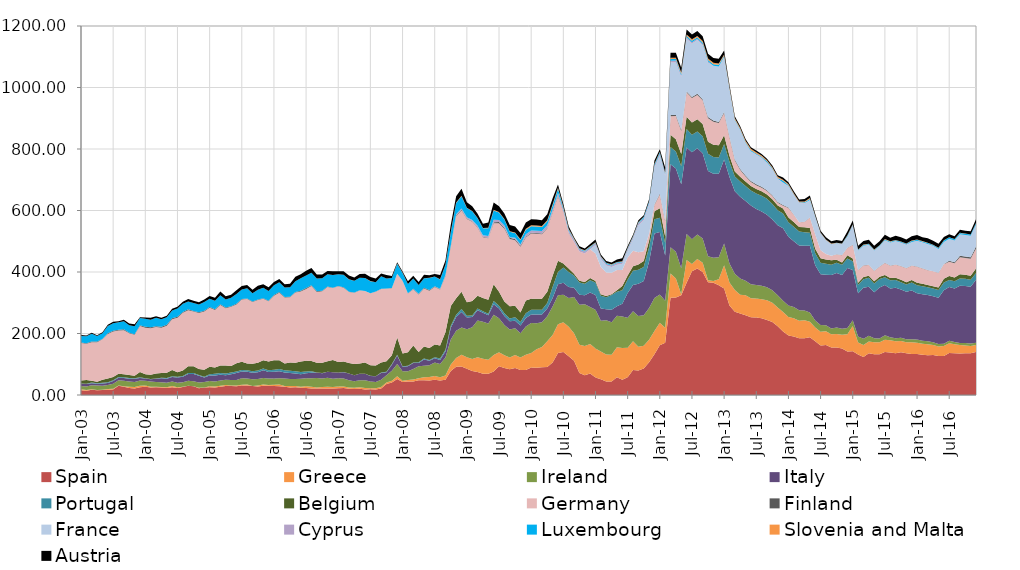
| Category | Spain | Greece | Ireland | Italy | Portugal | Belgium | Germany | Finland | France | Cyprus | Luxembourg | Slovenia and Malta | Austria |
|---|---|---|---|---|---|---|---|---|---|---|---|---|---|
| 2003-01-01 | 15.515 | 3.067 | 10.988 | 6.915 | 0.647 | 10.416 | 121.205 | 1.818 | 0 | 0 | 21.454 | 0 | 3.327 |
| 2003-02-01 | 13.8 | 2.514 | 11.517 | 7.706 | 1.084 | 12.039 | 118.189 | 1.772 | 0 | 0 | 22.341 | 0 | 2.363 |
| 2003-03-01 | 16.86 | 2.178 | 12.731 | 6.693 | 2.017 | 6.099 | 124.944 | 2.434 | 0 | 0 | 24.885 | 0 | 3.949 |
| 2003-04-01 | 15.463 | 1.047 | 14.236 | 5.653 | 1.968 | 5.075 | 127.952 | 2.67 | 0 | 0 | 17.618 | 0 | 2.282 |
| 2003-05-01 | 16.138 | 0.646 | 13.237 | 7.643 | 2.015 | 10.236 | 131.226 | 0.92 | 0 | 0 | 18.885 | 0 | 2.784 |
| 2003-06-01 | 17.219 | 2.057 | 13.414 | 6.483 | 2.591 | 11.643 | 145.262 | 2.526 | 0 | 0 | 23.576 | 0 | 3.982 |
| 2003-07-01 | 18.129 | 1.794 | 16.707 | 9.13 | 2.563 | 9.997 | 147.976 | 2.43 | 0 | 0 | 24.408 | 0 | 5.175 |
| 2003-08-01 | 30.088 | 1.069 | 16.866 | 8.367 | 2.132 | 10.587 | 140.59 | 2.233 | 0 | 0 | 24.505 | 0 | 3.4 |
| 2003-09-01 | 26.642 | 2.083 | 17.233 | 9.536 | 2.231 | 10.097 | 143.13 | 2.564 | 0 | 0 | 26.068 | 0 | 5.37 |
| 2003-10-01 | 22.472 | 4.554 | 16.546 | 9.413 | 1.936 | 10.04 | 136.182 | 0.892 | 0 | 0 | 25.028 | 0 | 5.225 |
| 2003-11-01 | 20.786 | 5.404 | 15.718 | 11.242 | 1.29 | 8.5 | 133.087 | 1.627 | 0 | 0 | 26.238 | 0 | 6.577 |
| 2003-12-01 | 25.563 | 4.342 | 17.509 | 8.191 | 2.493 | 16.749 | 149.156 | 2.85 | 0 | 0 | 23.402 | 0 | 2.897 |
| 2004-01-01 | 27.127 | 4.005 | 14.877 | 7.876 | 0.249 | 13.075 | 151.754 | 3.065 | 0 | 0 | 25.533 | 0 | 4.539 |
| 2004-02-01 | 24.424 | 2.443 | 16.656 | 7.992 | 0.851 | 13.217 | 151.34 | 3.357 | 0 | 0 | 24.462 | 0 | 6.624 |
| 2004-03-01 | 25.182 | 1.244 | 15.864 | 10.796 | 0.844 | 16.36 | 150.927 | 2.717 | 0 | 0 | 26.954 | 0 | 5.249 |
| 2004-04-01 | 24.353 | 1.353 | 15.658 | 12.733 | 1.626 | 16.201 | 146.595 | 3.059 | 0 | 0 | 25.053 | 0 | 4.723 |
| 2004-05-01 | 22.75 | 2.341 | 15.007 | 12.968 | 2.253 | 17.399 | 152.573 | 3 | 0 | 0 | 24.603 | 0 | 4.864 |
| 2004-06-01 | 25.291 | 3.888 | 14.862 | 14.899 | 2.435 | 19.843 | 165.092 | 3.232 | 0 | 0 | 25.497 | 0 | 5.296 |
| 2004-07-01 | 22.648 | 2.882 | 14.613 | 16.528 | 2.604 | 14.527 | 177.509 | 3.318 | 0 | 0 | 27.008 | 0 | 5.467 |
| 2004-08-01 | 26.131 | 0.549 | 14.929 | 17.773 | 2.694 | 17.852 | 187.26 | 2.982 | 0 | 0 | 26.824 | 0 | 6.161 |
| 2004-09-01 | 30.412 | 0.075 | 16.024 | 21.572 | 3.38 | 21.93 | 181.979 | 3.323 | 0 | 0 | 25.412 | 0 | 8.248 |
| 2004-10-01 | 28.083 | 0.691 | 15.811 | 23.414 | 3.417 | 21.951 | 177.901 | 1.65 | 0 | 0 | 25.949 | 0 | 7.851 |
| 2004-11-01 | 22.292 | 1.159 | 17.34 | 21.715 | 2.632 | 19.697 | 182.182 | 2.194 | 0 | 0 | 24.754 | 0 | 7.578 |
| 2004-12-01 | 24.537 | 0.201 | 17.44 | 14.63 | 2.873 | 22.695 | 188.903 | 2.45 | 0 | 0 | 28.354 | 0 | 8.854 |
| 2005-01-01 | 25.135 | 3.199 | 16.959 | 17.837 | 4.246 | 24.76 | 191.541 | 2.598 | 0 | 0 | 26.873 | 0 | 8.951 |
| 2005-02-01 | 24.35 | 3.499 | 16.11 | 19.5 | 5.957 | 19.657 | 187.186 | 2.89 | 0 | 0 | 27.187 | 0 | 9.655 |
| 2005-03-01 | 26.527 | 3.328 | 16.918 | 19.309 | 5.77 | 23.703 | 197.348 | 2.13 | 0 | 0 | 29.278 | 0 | 12.427 |
| 2005-04-01 | 29.672 | 2.498 | 17.1 | 15.045 | 5.803 | 25.551 | 186.301 | 2.215 | 0 | 0 | 26.72 | 0 | 9.909 |
| 2005-05-01 | 29.049 | 2.158 | 17.301 | 18.902 | 5.778 | 21.097 | 193.042 | 1.515 | 0 | 0 | 27.386 | 0 | 9.99 |
| 2005-06-01 | 28.525 | 2.338 | 18.004 | 22.543 | 5.154 | 26.289 | 191.856 | 1.827 | 0 | 0 | 32.257 | 0 | 11.493 |
| 2005-07-01 | 30.833 | 2.561 | 21.188 | 22.036 | 5.053 | 26.382 | 202.505 | 1.73 | 0 | 0 | 31.109 | 0 | 11.292 |
| 2005-08-01 | 31.234 | 2.84 | 19.294 | 22.137 | 5.054 | 22.284 | 209.497 | 1.76 | 0 | 0 | 32.759 | 0 | 10.832 |
| 2005-09-01 | 29.186 | 0.416 | 21.773 | 21.037 | 4.783 | 24.234 | 201.01 | 1.809 | 0 | 0 | 26.727 | 0 | 11.426 |
| 2005-10-01 | 27.844 | 2.96 | 21.423 | 22.071 | 5.374 | 24.845 | 204.499 | 1.921 | 0 | 0 | 31.377 | 0 | 12.68 |
| 2005-11-01 | 30.35 | 3.812 | 21.391 | 25.061 | 5.392 | 27.251 | 199.563 | 1.92 | 0 | 0 | 33.949 | 0 | 11.171 |
| 2005-12-01 | 30.312 | 2.354 | 20.99 | 21.277 | 5.392 | 28.95 | 195.335 | 1.692 | 0 | 0 | 31.796 | 0 | 12.512 |
| 2006-01-01 | 29.041 | 4.182 | 20.282 | 22.439 | 6.439 | 30.786 | 209.811 | 2.143 | 0 | 0 | 32.017 | 0 | 10.294 |
| 2006-02-01 | 28.63 | 5.319 | 20.845 | 22.097 | 7.501 | 28.238 | 219.683 | 2.605 | 0 | 0 | 31.843 | 0 | 10.408 |
| 2006-03-01 | 26.846 | 2.749 | 23.729 | 19.54 | 7.417 | 22.455 | 214.098 | 2.161 | 0 | 0 | 30.215 | 0 | 11.092 |
| 2006-04-01 | 24.753 | 4.803 | 22.126 | 19.671 | 7.312 | 26.868 | 212.076 | 1.875 | 0 | 0 | 31.208 | 0 | 11.319 |
| 2006-05-01 | 25.273 | 4.109 | 22.89 | 17.83 | 7.305 | 27.16 | 228.451 | 2.33 | 0 | 0 | 34.753 | 0 | 14.381 |
| 2006-06-01 | 23.339 | 3.128 | 26.001 | 14.791 | 7.777 | 34.067 | 227.597 | 2.723 | 0 | 0 | 40.583 | 0 | 13.007 |
| 2006-07-01 | 22.688 | 5.488 | 26.269 | 16.335 | 5.931 | 34.372 | 233.938 | 2.89 | 0 | 0 | 40.62 | 0 | 15.932 |
| 2006-08-01 | 21.423 | 5.652 | 27.608 | 17.806 | 4.588 | 33.77 | 243.679 | 2.418 | 0 | 0 | 40.981 | 0 | 15.141 |
| 2006-09-01 | 21.299 | 3.355 | 30.36 | 18.12 | 0.226 | 31.343 | 230.228 | 2.707 | 0 | 0 | 40.906 | 0 | 13.326 |
| 2006-10-01 | 21.32 | 4.339 | 28.024 | 17.418 | 0.187 | 33.44 | 232.304 | 1.927 | 0 | 0 | 40.837 | 0 | 11.994 |
| 2006-11-01 | 21.332 | 5.596 | 28.861 | 20.02 | 0.159 | 33.569 | 241.453 | 2.124 | 0 | 0 | 39.963 | 0 | 10.273 |
| 2006-12-01 | 21.168 | 4.795 | 27.044 | 20.957 | 0.161 | 39.91 | 233.634 | 1.025 | 0 | 0 | 41.511 | 0 | 12.151 |
| 2007-01-01 | 21.706 | 5.92 | 27.13 | 18.329 | 0.189 | 34.317 | 246.094 | 0.875 | 0 | 0 | 38.23 | 0.007 | 9.683 |
| 2007-02-01 | 22.575 | 5.105 | 26.146 | 20.507 | 0.181 | 34.329 | 240.265 | 0.895 | 0 | 0 | 41.336 | 0.05 | 11.208 |
| 2007-03-01 | 20.577 | 3.533 | 24.02 | 21.664 | 0.169 | 34.335 | 230.706 | 0.846 | 0 | 0 | 40.128 | 0.086 | 12.534 |
| 2007-04-01 | 19.447 | 4.297 | 20.717 | 19.462 | 0.502 | 36.13 | 232.105 | 0.836 | 0 | 0 | 38.147 | 0.074 | 10.245 |
| 2007-05-01 | 20.312 | 4.768 | 23.126 | 20.882 | 0.177 | 33.189 | 237.712 | 0.633 | 0 | 0 | 40.122 | 0.116 | 12.433 |
| 2007-06-01 | 18.244 | 4.193 | 25.535 | 20.825 | 0.234 | 36.672 | 232.709 | 0 | 0 | 0 | 41.904 | 0.113 | 13.982 |
| 2007-07-01 | 18.324 | 3.874 | 21.696 | 18.102 | 0.21 | 34.579 | 233.831 | 0 | 0 | 0 | 39.57 | 0.146 | 13.326 |
| 2007-08-01 | 17.998 | 3.833 | 20.066 | 18.95 | 0.234 | 34.662 | 240.293 | 0.21 | 0 | 0 | 30.242 | 0.132 | 11.921 |
| 2007-09-01 | 20.992 | 4.682 | 23.751 | 21.802 | 1.554 | 32.769 | 239.263 | 0.422 | 0 | 0 | 40.875 | 0.193 | 9.003 |
| 2007-10-01 | 36.132 | 4.582 | 23.864 | 9.309 | 1.536 | 34.256 | 236.064 | 0.535 | 0 | 0 | 32.393 | 0.178 | 11.496 |
| 2007-11-01 | 40.486 | 5.476 | 32.522 | 20.222 | 1.993 | 28.791 | 217.358 | 0.757 | 0 | 0 | 32.949 | 0.213 | 5.932 |
| 2007-12-01 | 52.308 | 8.727 | 39.449 | 28.07 | 2.464 | 56.312 | 206.724 | 0.23 | 0 | 0 | 32.915 | 0.156 | 4.188 |
| 2008-01-01 | 42.617 | 4.042 | 30.727 | 14.314 | 1.876 | 41.413 | 236.661 | 0.2 | 0 | 0.02 | 25.233 | 0.078 | 4.601 |
| 2008-02-01 | 44.287 | 4.73 | 28.298 | 15.918 | 2.098 | 43.384 | 191.385 | 1.098 | 0 | 0.08 | 29.871 | 0.222 | 8.677 |
| 2008-03-01 | 44.014 | 6.223 | 34.395 | 19.314 | 1.879 | 55.186 | 182.304 | 1.749 | 0 | 0.24 | 33.487 | 0.232 | 8.791 |
| 2008-04-01 | 47.99 | 6.853 | 38.568 | 10.349 | 2.692 | 33.624 | 186.65 | 1.981 | 0 | 0.24 | 28.504 | 0.226 | 10.098 |
| 2008-05-01 | 48.352 | 9.483 | 36.888 | 20.668 | 3.138 | 39.387 | 188.316 | 2.151 | 0 | 0.289 | 30.787 | 0.102 | 11.235 |
| 2008-06-01 | 47.161 | 11.372 | 38.373 | 14.658 | 2.516 | 38.465 | 186.268 | 2.346 | 0 | 0.36 | 39.243 | 0.307 | 8.752 |
| 2008-07-01 | 49.472 | 11.997 | 44.121 | 14.113 | 3.299 | 41.371 | 186.55 | 1.844 | 0 | 0.704 | 31.721 | 0.21 | 8.238 |
| 2008-08-01 | 46.805 | 10.624 | 43.307 | 12.717 | 5.517 | 41.764 | 182.643 | 1.177 | 0 | 0.77 | 30.621 | 0.261 | 13.751 |
| 2008-09-01 | 49.383 | 14.148 | 58.671 | 19.459 | 5.472 | 57.032 | 181.834 | 2.564 | 0 | 1.651 | 32.813 | 0.547 | 13.759 |
| 2008-10-01 | 78.249 | 20.543 | 81.765 | 38.152 | 6.652 | 63.923 | 193.421 | 3.074 | 0 | 0 | 43.664 | 1.046 | 23.2 |
| 2008-11-01 | 91.692 | 28.647 | 88.34 | 44.857 | 7.647 | 53.513 | 266.752 | 2.53 | 0 | 3.556 | 36.886 | 1.195 | 20.818 |
| 2008-12-01 | 92.794 | 38.349 | 88.562 | 49.955 | 10.21 | 56.235 | 263.65 | 2.45 | 0 | 4.37 | 40.081 | 1.652 | 22.515 |
| 2009-01-01 | 85.662 | 36.794 | 91.174 | 38.478 | 5.235 | 44.322 | 270.446 | 1.7 | 0 | 4.104 | 29.858 | 1.193 | 18.083 |
| 2009-02-01 | 78.359 | 38.406 | 103.39 | 33.395 | 5.155 | 46.65 | 257.89 | 1.93 | 0 | 4.083 | 28.073 | 0.96 | 15.555 |
| 2009-03-01 | 74.596 | 47.87 | 119.728 | 33.631 | 5.366 | 41.817 | 220.746 | 1.38 | 0 | 5.661 | 24.059 | 1.011 | 13.734 |
| 2009-04-01 | 69.012 | 48.679 | 120.577 | 29.52 | 4.878 | 42.531 | 197.498 | 1.66 | 0 | 5.342 | 22.399 | 0.978 | 14.027 |
| 2009-05-01 | 69.199 | 45.515 | 118.087 | 26.659 | 4.951 | 45.706 | 199.397 | 1.47 | 0 | 6.41 | 25.133 | 1.332 | 16.865 |
| 2009-06-01 | 76.355 | 53.915 | 130.423 | 34.187 | 10.543 | 54.535 | 198.341 | 3.845 | 0 | 7.768 | 30.47 | 2.194 | 23.081 |
| 2009-07-01 | 93.571 | 45.743 | 110.215 | 31.397 | 9.314 | 45.725 | 222.519 | 3.815 | 0 | 6.739 | 24.15 | 2.109 | 18.6 |
| 2009-08-01 | 88.008 | 40.983 | 98.403 | 29.257 | 9.395 | 37.778 | 236.642 | 3.755 | 0 | 7.183 | 19.466 | 1.736 | 17.946 |
| 2009-09-01 | 83.914 | 37.908 | 91.573 | 26.563 | 9.164 | 39.623 | 218.518 | 3.755 | 0 | 1.639 | 18.028 | 1.794 | 20.047 |
| 2009-10-01 | 87.964 | 42.025 | 87.404 | 24.447 | 11.374 | 36.624 | 213.123 | 4.26 | 0 | 4.302 | 14.935 | 1.96 | 19.567 |
| 2009-11-01 | 80.924 | 41.3 | 78.664 | 24.846 | 11.753 | 31.187 | 213.401 | 3.37 | 0 | 4.245 | 14.753 | 2.357 | 20.126 |
| 2009-12-01 | 81.441 | 49.655 | 91.958 | 27.138 | 16.016 | 41.277 | 204.761 | 2.69 | 0 | 7.559 | 15.156 | 3.368 | 20.236 |
| 2010-01-01 | 89.241 | 47.284 | 97.733 | 27.413 | 15.238 | 36.277 | 211.656 | 2.59 | 0 | 7.542 | 14.048 | 3.294 | 19.434 |
| 2010-02-01 | 88.683 | 59.754 | 84.998 | 28.304 | 15.293 | 36.275 | 210.792 | 2.49 | 0 | 7.49 | 13.542 | 3.278 | 19.504 |
| 2010-03-01 | 90.192 | 65.504 | 81.043 | 24.73 | 15.455 | 36.255 | 209.716 | 2.39 | 0 | 7.906 | 12.966 | 3.33 | 19.109 |
| 2010-04-01 | 90.787 | 84.077 | 81.253 | 25.284 | 17.721 | 36.281 | 205.849 | 2.54 | 0 | 8.028 | 12.893 | 3.368 | 19.509 |
| 2010-05-01 | 105.55 | 89.426 | 92.433 | 28.369 | 35.521 | 36.275 | 205.226 | 2.545 | 0 | 8.267 | 12.888 | 3.51 | 19.808 |
| 2010-06-01 | 136.49 | 93.817 | 94.232 | 35.446 | 40.194 | 36.281 | 209.413 | 2.545 | 0 | 8.606 | 13.634 | 3.456 | 10.128 |
| 2010-07-01 | 140.017 | 96.209 | 89.456 | 39.76 | 48.834 | 13.729 | 168.005 | 0.54 | 0 | 7.528 | 5.219 | 2.74 | 9.283 |
| 2010-08-01 | 125.628 | 95.947 | 94.071 | 35.571 | 49.124 | 11.382 | 114.572 | 0.54 | 0 | 7.594 | 3.8 | 2.545 | 8.163 |
| 2010-09-01 | 111.756 | 89.047 | 117.906 | 30.1 | 39.717 | 5.91 | 102.922 | 0.54 | 0 | 6.97 | 1.819 | 2.242 | 4.034 |
| 2010-10-01 | 71.285 | 92.38 | 130.039 | 31.949 | 40.044 | 5.787 | 94.918 | 0.115 | 0 | 6.874 | 1.827 | 2.352 | 5.994 |
| 2010-11-01 | 64.457 | 95.05 | 135.899 | 28.654 | 37.935 | 5.646 | 92.616 | 0.09 | 0 | 6.469 | 1.931 | 2.09 | 5.895 |
| 2010-12-01 | 69.735 | 96.406 | 119.68 | 47.57 | 40.035 | 7.215 | 93.083 | 0.05 | 0 | 5.466 | 2.769 | 1.666 | 7.697 |
| 2011-01-01 | 57.12 | 94.433 | 126.01 | 47.413 | 41.008 | 4.991 | 89.272 | 0.05 | 27.3 | 5.559 | 2.068 | 1.492 | 9.095 |
| 2011-02-01 | 50.943 | 90.444 | 99.835 | 40.236 | 41.078 | 4.938 | 88.606 | 0.05 | 26 | 5.497 | 1.935 | 1.585 | 5.717 |
| 2011-03-01 | 43.823 | 87.93 | 111.105 | 36.063 | 39.116 | 4.171 | 75.973 | 0.05 | 23.3 | 4.878 | 2.611 | 1.327 | 5.281 |
| 2011-04-01 | 43.821 | 86.854 | 106.13 | 40.734 | 48.009 | 2.179 | 69.613 | 0.05 | 19 | 4.95 | 2.523 | 1.368 | 5.631 |
| 2011-05-01 | 57.852 | 97.531 | 102.295 | 30.826 | 47.204 | 5.014 | 65.64 | 0.05 | 17.3 | 5.35 | 2.379 | 1.423 | 7.743 |
| 2011-06-01 | 49.455 | 103.04 | 102.8 | 41.315 | 43.884 | 13.846 | 52.073 | 0.05 | 19.6 | 5.57 | 1.988 | 1.553 | 9.201 |
| 2011-07-01 | 57.364 | 96.293 | 97.593 | 80.487 | 44.226 | 12.485 | 58.533 | 0.07 | 22.3 | 5.476 | 2.109 | 1.607 | 6.038 |
| 2011-08-01 | 81.607 | 93.094 | 97.878 | 85.087 | 46.017 | 15.117 | 50.033 | 0.1 | 37.4 | 5.654 | 2.64 | 1.444 | 5.061 |
| 2011-09-01 | 79.359 | 77.426 | 100.355 | 104.683 | 45.621 | 16.661 | 40.207 | 0.05 | 86.7 | 7.674 | 2.332 | 1.214 | 6.152 |
| 2011-10-01 | 86.178 | 74.062 | 99.24 | 111.288 | 45.535 | 19.797 | 31.502 | 0.16 | 100.6 | 5.378 | 4.715 | 1.368 | 4.712 |
| 2011-11-01 | 106.28 | 73.412 | 102.91 | 151.799 | 45.683 | 22.366 | 22.074 | 0.16 | 95 | 5.744 | 3.551 | 1.462 | 5.837 |
| 2011-12-01 | 132.411 | 76.12 | 106.806 | 209.995 | 46.002 | 26.176 | 20.644 | 2.311 | 118.5 | 5.521 | 5.199 | 2.238 | 10.612 |
| 2012-01-01 | 161.421 | 73.184 | 92.616 | 202.523 | 46.434 | 31.358 | 44.684 | 2.311 | 124.3 | 5.913 | 4.349 | 2.242 | 8.122 |
| 2012-02-01 | 169.802 | 49.192 | 87.121 | 147.847 | 39.481 | 22.476 | 48.529 | 2.311 | 146.1 | 5.227 | 3.205 | 2.187 | 16.295 |
| 2012-03-01 | 316.342 | 78.743 | 85.071 | 270.015 | 56.01 | 39.997 | 60.646 | 3.681 | 170.9 | 5.938 | 5.025 | 4.353 | 15.937 |
| 2012-04-01 | 316.934 | 62.022 | 86.826 | 270.973 | 55.425 | 39.925 | 75.037 | 3.681 | 170.5 | 6.269 | 5.069 | 4.348 | 15.716 |
| 2012-05-01 | 324.642 | 3.391 | 84.456 | 272.703 | 58.704 | 40.045 | 74.764 | 3.681 | 170.7 | 6.116 | 5.026 | 4.397 | 15.719 |
| 2012-06-01 | 364.997 | 73.66 | 84.644 | 281.44 | 60.494 | 39.97 | 78.371 | 3.701 | 170.7 | 5.175 | 5.002 | 4.398 | 15.717 |
| 2012-07-31 | 402.185 | 23.998 | 80.02 | 283.27 | 56.833 | 39.8 | 79.575 | 3.681 | 174 | 3.716 | 4.999 | 4.556 | 15.712 |
| 2012-08-31 | 411.654 | 30.864 | 79.121 | 280.711 | 54.865 | 39.721 | 78.878 | 3.681 | 175 | 3.72 | 4.99 | 4.507 | 15.715 |
| 2012-09-30 | 399.928 | 30.259 | 79.071 | 276.734 | 55.571 | 39.72 | 77.075 | 3.681 | 175.7 | 3.721 | 4.99 | 4.55 | 15.718 |
| 2012-10-31 | 366.934 | 6.518 | 78.171 | 276.469 | 56.091 | 39.72 | 76.252 | 3.681 | 177 | 3.726 | 4.99 | 4.622 | 15.789 |
| 2012-11-30 | 364.859 | 5.605 | 75.656 | 273.268 | 54.591 | 40.01 | 74.852 | 3.681 | 178 | 0.476 | 4.89 | 4.487 | 15.767 |
| 2012-12-31 | 357.292 | 19.346 | 70.936 | 271.784 | 52.784 | 40.01 | 72.301 | 3.681 | 179.5 | 0.411 | 5.675 | 4.36 | 15.714 |
| 2013-01-31 | 346.049 | 76.223 | 70.061 | 273.859 | 49.699 | 29.22 | 71.728 | 3.681 | 179 | 0.376 | 3.085 | 4.203 | 13.369 |
| 2013-02-28 | 290.924 | 75.23 | 61.881 | 281.008 | 49.502 | 19.17 | 59.594 | 3.681 | 152.7 | 0.376 | 2.765 | 4.262 | 7.968 |
| 2013-03-31 | 270.941 | 70.678 | 53.051 | 268.062 | 47.78 | 16.171 | 35.574 | 3.641 | 126.9 | 0.376 | 2.741 | 4.269 | 6.42 |
| 2013-04-30 | 265.077 | 60.909 | 52.756 | 265.729 | 49.818 | 15.13 | 21.941 | 3.641 | 126.1 | 0.334 | 2.74 | 4.216 | 5.291 |
| 2013-05-31 | 259.318 | 65.395 | 46.901 | 259.178 | 48.722 | 14.485 | 16.554 | 3.291 | 106.1 | 0.334 | 2.74 | 4.13 | 5.131 |
| 2013-06-30 | 253.142 | 61.138 | 46.111 | 255.499 | 49.386 | 14.535 | 13.153 | 3.191 | 96.3 | 0.354 | 3.45 | 4.159 | 5.459 |
| 2013-07-31 | 251.885 | 62.039 | 43.621 | 247.703 | 50.125 | 14.535 | 12.321 | 3.191 | 95.9 | 1.584 | 2.74 | 4.07 | 5.074 |
| 2013-08-31 | 249.31 | 62.317 | 43.276 | 241.513 | 51.565 | 14.395 | 11.886 | 3.116 | 93 | 1.584 | 2.74 | 4.044 | 4.934 |
| 2013-09-30 | 244.244 | 63.823 | 42.576 | 235.395 | 51.84 | 14.395 | 10.784 | 2.475 | 89.2 | 1.639 | 3.54 | 3.709 | 4.954 |
| 2013-10-31 | 237.39 | 62.499 | 40.806 | 230.28 | 50.529 | 15.47 | 10.257 | 2.475 | 83.6 | 1.634 | 2.39 | 3.639 | 5.131 |
| 2013-11-30 | 223.865 | 60.676 | 39.651 | 227.693 | 48.913 | 15.285 | 8.932 | 2.475 | 75.1 | 1.55 | 1.89 | 3.596 | 5.134 |
| 2013-12-31 | 206.76 | 63.166 | 36.796 | 235.869 | 47.744 | 15.985 | 8.876 | 2.475 | 71.7 | 1.6 | 5.819 | 3.537 | 7.094 |
| 2014-01-31 | 193.42 | 60.465 | 37.126 | 223.673 | 47.009 | 15.259 | 31.521 | 1.6 | 69.2 | 1.6 | 1.995 | 3.235 | 6.029 |
| 2014-02-28 | 190.588 | 58.747 | 36.601 | 214.355 | 46.747 | 15.207 | 24.247 | 0.525 | 62.5 | 1.6 | 1.427 | 3.204 | 6.566 |
| 2014-03-31 | 184.904 | 56.902 | 33.481 | 211.046 | 45.047 | 14.8 | 15.438 | 0.495 | 61.9 | 1.6 | 1.105 | 2.9 | 5.95 |
| 2014-04-30 | 184.332 | 58.838 | 31.391 | 210.499 | 44.579 | 16.122 | 17.181 | 0.495 | 59.3 | 1.4 | 2.608 | 2.64 | 8.398 |
| 2014-05-31 | 187.872 | 50.658 | 30.036 | 216.437 | 42.274 | 16.17 | 33.072 | 0.48 | 56.1 | 1.4 | 3.244 | 2.528 | 8.423 |
| 2014-06-30 | 174.453 | 44.953 | 23.246 | 179.632 | 38.421 | 15.14 | 46.48 | 0.484 | 55.7 | 1.4 | 1.266 | 2.063 | 5.988 |
| 2014-07-31 | 160.699 | 44.619 | 22.161 | 164.966 | 37.88 | 14.265 | 26.033 | 0.484 | 53.8 | 0.85 | 0.666 | 1.759 | 6.228 |
| 2014-08-31 | 162.579 | 44.566 | 19.851 | 163.814 | 35.807 | 14.065 | 17.467 | 0.486 | 43.7 | 0.95 | 0.666 | 1.493 | 7.553 |
| 2014-09-30 | 154.849 | 42.567 | 19.035 | 173.923 | 33.375 | 14.783 | 14.124 | 0.549 | 36.3 | 0.92 | 0.906 | 1.134 | 7.24 |
| 2014-10-31 | 154.793 | 43.852 | 20.485 | 177.432 | 33.356 | 9.533 | 17.784 | 0.553 | 34.7 | 0.92 | 0.916 | 1.135 | 8.42 |
| 2014-11-30 | 151 | 44.853 | 19.315 | 174.826 | 33.977 | 7.183 | 22.93 | 0.947 | 35.1 | 0.89 | 0.916 | 1.086 | 7.82 |
| 2014-12-31 | 141.622 | 56.039 | 20.6 | 194.522 | 31.191 | 10.835 | 23.249 | 0.707 | 34.5 | 1.116 | 3.357 | 1.509 | 12.659 |
| 2015-01-31 | 141.926 | 82.244 | 18.9 | 163.216 | 28.284 | 8.96 | 44.08 | 0.627 | 62.4 | 1.116 | 2.157 | 1.328 | 12.58 |
| 2015-02-28 | 132.072 | 38.61 | 19.235 | 141.329 | 27.561 | 6.27 | 40.794 | 0.527 | 62.55 | 1.066 | 2.257 | 1.085 | 12.215 |
| 2015-03-31 | 123.905 | 38.54 | 20.325 | 165.696 | 28.178 | 6.999 | 37.508 | 0.67 | 62.7 | 1.036 | 2.257 | 1.221 | 12.018 |
| 2015-04-30 | 135.88 | 38.441 | 18.131 | 159.224 | 29.299 | 6.999 | 35.034 | 0.67 | 64.2 | 0.996 | 1.997 | 1.251 | 12.606 |
| 2015-05-31 | 132.853 | 38.8 | 13.125 | 149.474 | 28.518 | 6.999 | 33.713 | 0.67 | 64.65 | 0.996 | 2.007 | 1.191 | 12.62 |
| 2015-06-30 | 132.396 | 39.44 | 12.135 | 165.674 | 27.701 | 7.589 | 32.392 | 0.69 | 65.1 | 0.762 | 2.157 | 1.048 | 12.638 |
| 2015-07-31 | 139.766 | 39.923 | 14.76 | 162.894 | 25.746 | 7.538 | 38.5 | 0.69 | 72.9 | 0.756 | 2.557 | 1.022 | 14.343 |
| 2015-08-01 | 138.028 | 40.018 | 10.06 | 158.287 | 26.491 | 7.438 | 40.178 | 0.69 | 74.35 | 0.736 | 2.357 | 0.989 | 12.072 |
| 2015-09-01 | 135.835 | 38.983 | 9.99 | 164.002 | 25.114 | 7.738 | 41.855 | 0.69 | 75.8 | 0.736 | 2.357 | 1.01 | 13.759 |
| 2015-10-01 | 139.06 | 36.578 | 10.32 | 157.338 | 23.759 | 7.788 | 43.585 | 0.69 | 75.5 | 1.186 | 2.347 | 0.946 | 13.868 |
| 2015-11-01 | 135.87 | 35.9 | 9.765 | 154.345 | 23.235 | 7.808 | 45.044 | 0.69 | 75.55 | 1.086 | 2.447 | 1.012 | 13.338 |
| 2015-12-01 | 133.221 | 38.57 | 9.805 | 158.276 | 26.161 | 7.738 | 46.504 | 0.69 | 75.6 | 0.886 | 3.657 | 1.093 | 14.123 |
| 2016-01-01 | 132.962 | 37.225 | 10.07 | 150.978 | 25.924 | 7.638 | 52.047 | 0.69 | 83.5 | 0.89 | 3.037 | 1.042 | 14.506 |
| 2016-02-01 | 130.767 | 36.1 | 9.75 | 151.136 | 25.937 | 7.813 | 50.132 | 0.69 | 83.5 | 0.866 | 2.747 | 1.048 | 12.143 |
| 2016-03-01 | 129.636 | 35.21 | 9.816 | 150.824 | 24.546 | 7.638 | 48.217 | 0.69 | 84 | 0.736 | 3.147 | 1.005 | 14.533 |
| 2016-04-01 | 129.849 | 32.565 | 8.885 | 150.204 | 24.874 | 7.638 | 48.04 | 0.725 | 81.8 | 0.736 | 2.438 | 0.957 | 13.168 |
| 2016-05-31 | 127.077 | 30.805 | 8.366 | 150.127 | 25.315 | 7.638 | 47.674 | 0.725 | 76.257 | 0.936 | 2.837 | 0.917 | 12.793 |
| 2016-06-30 | 126.842 | 32.65 | 7.341 | 173.898 | 24.793 | 12.557 | 47.309 | 0.825 | 70.714 | 0.7 | 4.818 | 0.608 | 10.448 |
| 2016-07-31 | 136.949 | 31.35 | 7.938 | 174.664 | 23.208 | 12.521 | 46.37 | 3.46 | 70.779 | 0.7 | 4.738 | 0.602 | 9.628 |
| 2016-08-31 | 135.76 | 29.56 | 6.788 | 174.478 | 23.135 | 12.671 | 46.169 | 3.46 | 69.679 | 0.7 | 4.338 | 0.573 | 8.623 |
| 2016-09-30 | 134.768 | 27.745 | 6.788 | 186.383 | 23.521 | 13.502 | 55.343 | 4.958 | 69.026 | 0.65 | 4.538 | 0.7 | 9.322 |
| 2016-10-31 | 135.508 | 25.46 | 8.138 | 185.152 | 23.525 | 13.317 | 54.562 | 4.958 | 69.017 | 0.65 | 4.108 | 0.68 | 9.187 |
| 2016-11-30 | 135.987 | 23.2 | 7.988 | 185.13 | 22.221 | 13.517 | 54.757 | 4.959 | 69.101 | 0.65 | 4.109 | 0.678 | 10.007 |
| 2016-12-31 | 139.863 | 22.93 | 7.438 | 204.238 | 22.372 | 14.322 | 65.325 | 6.728 | 70.73 | 0.65 | 4.907 | 0.769 | 11.346 |